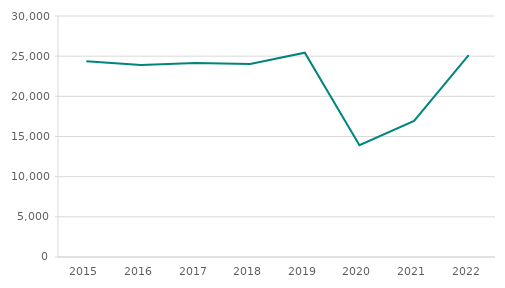
| Category | Totalt |
|---|---|
| 2015.0 | 24364 |
| 2016.0 | 23894 |
| 2017.0 | 24147 |
| 2018.0 | 24014 |
| 2019.0 | 25433 |
| 2020.0 | 13919 |
| 2021.0 | 16946 |
| 2022.0 | 25119 |